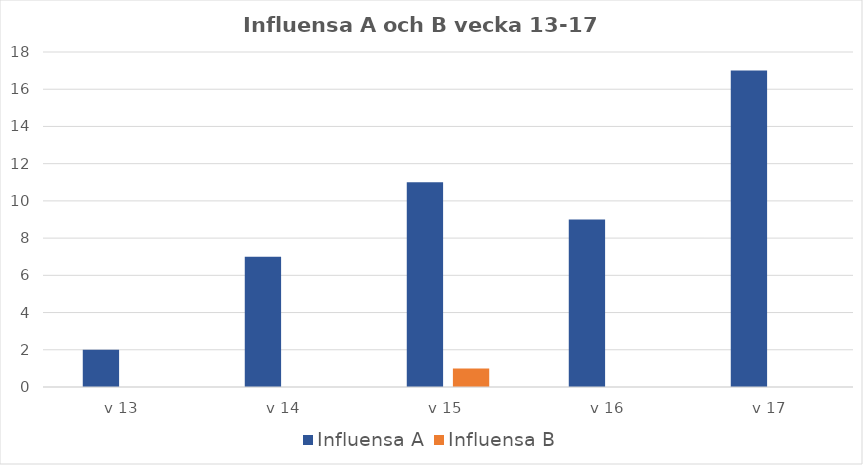
| Category | Influensa A | Influensa B |
|---|---|---|
| v 13 | 2 | 0 |
| v 14 | 7 | 0 |
| v 15 | 11 | 1 |
| v 16 | 9 | 0 |
| v 17 | 17 | 0 |